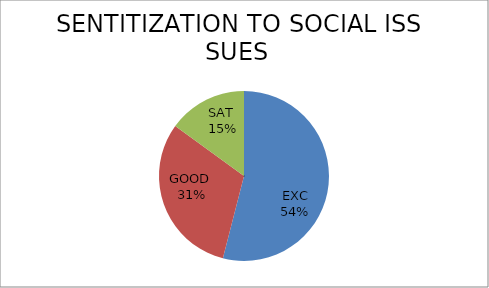
| Category | Series 0 |
|---|---|
| EXC | 54 |
| GOOD  | 31 |
| SAT  | 15 |